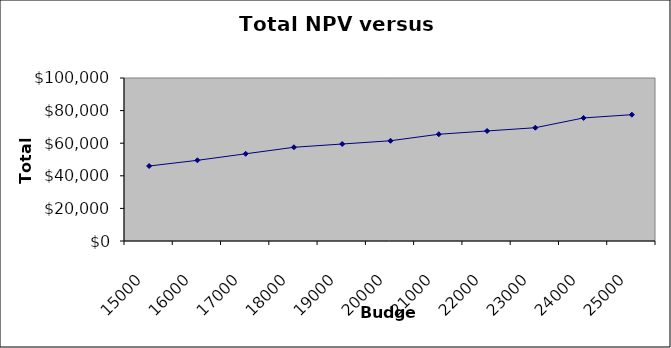
| Category | Series 0 |
|---|---|
| 15000.0 | 46000 |
| 16000.0 | 49500 |
| 17000.0 | 53500 |
| 18000.0 | 57500 |
| 19000.0 | 59500 |
| 20000.0 | 61500 |
| 21000.0 | 65500 |
| 22000.0 | 67500 |
| 23000.0 | 69500 |
| 24000.0 | 75500 |
| 25000.0 | 77500 |